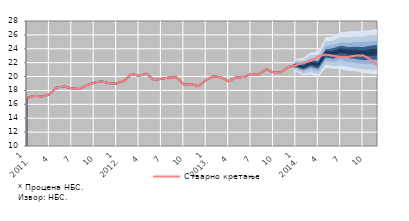
| Category | Series 11 | Стварно кретање |
|---|---|---|
| 1
2011. | 16.951 | 16.951 |
| 2 | 17.234 | 17.234 |
| 3 | 17.104 | 17.104 |
| 4 | 17.44 | 17.44 |
| 5 | 18.447 | 18.447 |
| 6 | 18.557 | 18.557 |
| 7 | 18.303 | 18.303 |
| 8 | 18.203 | 18.203 |
| 9 | 18.761 | 18.761 |
| 10 | 19.13 | 19.13 |
| 11 | 19.304 | 19.304 |
| 12 | 19.034 | 19.034 |
| 1
2012. | 18.997 | 18.997 |
| 2 | 19.387 | 19.387 |
| 3 | 20.362 | 20.362 |
| 4 | 20.11 | 20.11 |
| 5 | 20.418 | 20.418 |
| 6 | 19.501 | 19.501 |
| 7 | 19.678 | 19.678 |
| 8 | 19.868 | 19.868 |
| 9 | 19.906 | 19.906 |
| 10 | 18.849 | 18.849 |
| 11 | 18.906 | 18.906 |
| 12 | 18.625 | 18.625 |
| 1
2013. | 19.53 | 19.53 |
| 2 | 20.05 | 20.05 |
| 3 | 19.876 | 19.876 |
| 4 | 19.312 | 19.312 |
| 5 | 19.885 | 19.885 |
| 6 | 19.929 | 19.929 |
| 7 | 20.358 | 20.358 |
| 8 | 20.255 | 20.255 |
| 9 | 21.063 | 21.063 |
| 10 | 20.606 | 20.606 |
| 11 | 20.637 | 20.637 |
| 12 | 21.374 | 21.374 |
| 1
2014. | 21.625 | 21.616 |
| 2 | 21.356 | 21.987 |
| 3 | 21.876 | 22.249 |
| 4 | 21.655 | 22.912 |
| 5 | 23.383 | 23.157 |
| 6 | 23.346 | 23.009 |
| 7 | 23.698 | 22.8 |
| 8 | 23.533 | 22.823 |
| 9 | 23.455 | 23.01 |